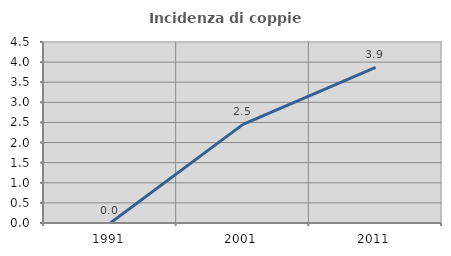
| Category | Incidenza di coppie miste |
|---|---|
| 1991.0 | 0 |
| 2001.0 | 2.452 |
| 2011.0 | 3.867 |